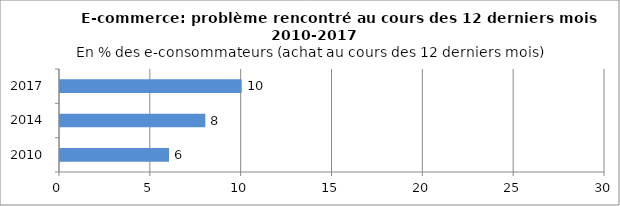
| Category | A rencontré un problème  |
|---|---|
| 2010.0 | 6 |
| 2014.0 | 8 |
| 2017.0 | 10 |